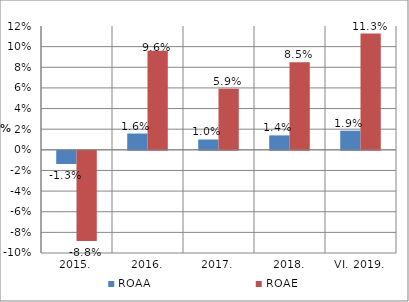
| Category | ROAA | ROAE |
|---|---|---|
| 2015. | -0.013 | -0.088 |
| 2016. | 0.016 | 0.096 |
| 2017. | 0.01 | 0.059 |
| 2018. | 0.014 | 0.085 |
| VI. 2019. | 0.019 | 0.113 |